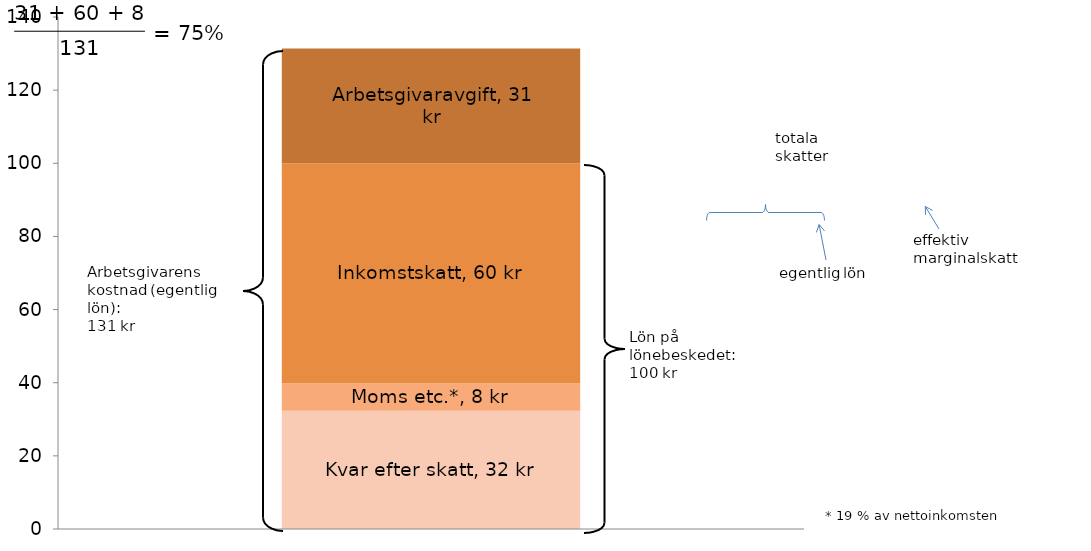
| Category | Kvar efter skatt | Moms etc.* | Inkomstskatt | Arbetsgivaravgift |
|---|---|---|---|---|
| 0 | 32.303 | 7.577 | 60.12 | 31.42 |